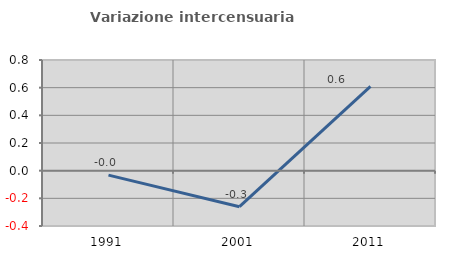
| Category | Variazione intercensuaria annua |
|---|---|
| 1991.0 | -0.032 |
| 2001.0 | -0.26 |
| 2011.0 | 0.61 |